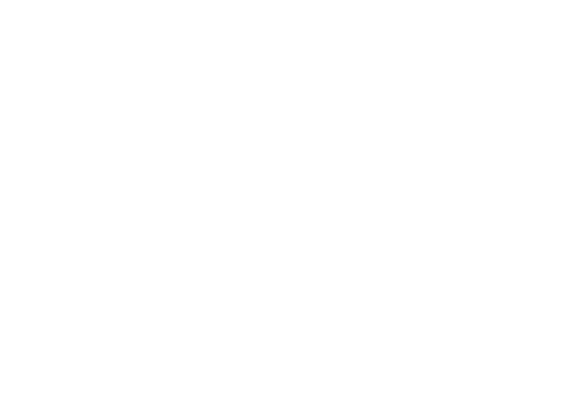
| Category | Total |
|---|---|
| SI  | 2061 |
| NO  | 585 |